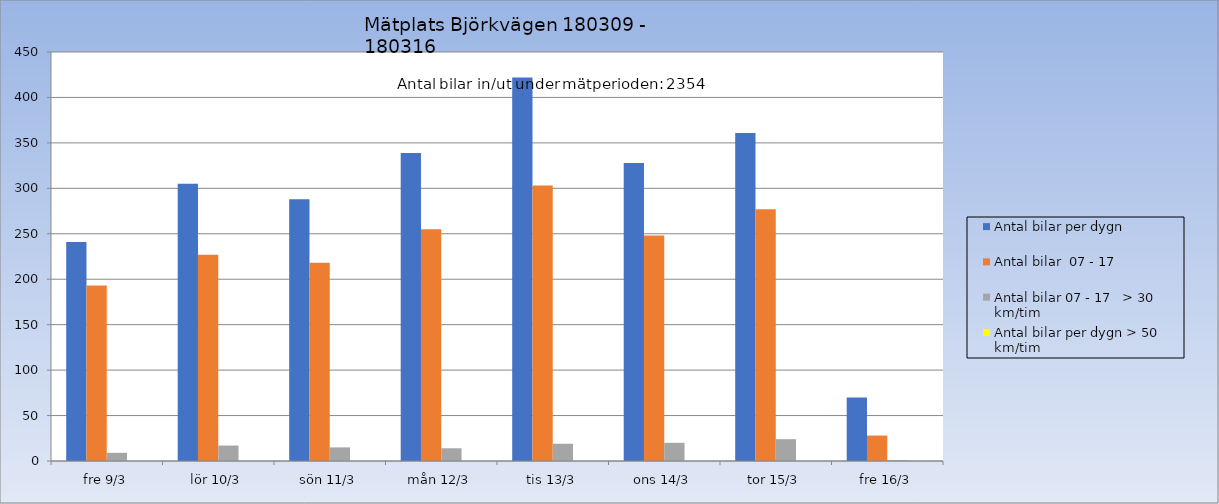
| Category | Antal bilar per dygn | Antal bilar  07 - 17 | Antal bilar 07 - 17   > 30 km/tim | Antal bilar per dygn > 50 km/tim |
|---|---|---|---|---|
| fre 9/3 | 241 | 193 | 9 | 0 |
| lör 10/3 | 305 | 227 | 17 | 0 |
| sön 11/3 | 288 | 218 | 15 | 0 |
| mån 12/3 | 339 | 255 | 14 | 0 |
| tis 13/3 | 422 | 303 | 19 | 0 |
| ons 14/3 | 328 | 248 | 20 | 0 |
| tor 15/3 | 361 | 277 | 24 | 0 |
| fre 16/3 | 70 | 28 | 1 | 0 |